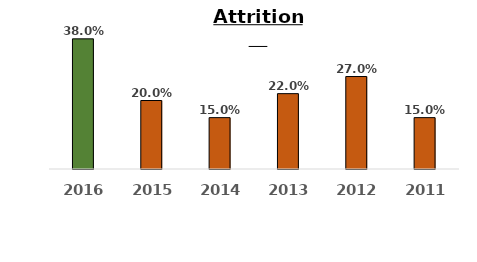
| Category | Series 0 |
|---|---|
| 2016.0 | 0.38 |
| 2015.0 | 0.2 |
| 2014.0 | 0.15 |
| 2013.0 | 0.22 |
| 2012.0 | 0.27 |
| 2011.0 | 0.15 |